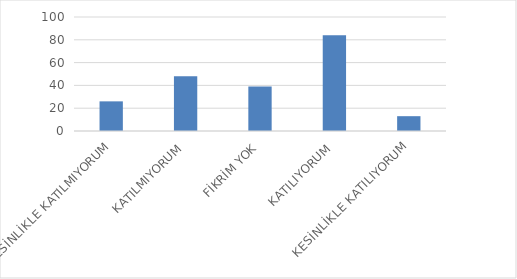
| Category | Series 0 |
|---|---|
| KESİNLİKLE KATILMIYORUM | 26 |
| KATILMIYORUM | 48 |
| FİKRİM YOK | 39 |
| KATILIYORUM | 84 |
| KESİNLİKLE KATILIYORUM | 13 |